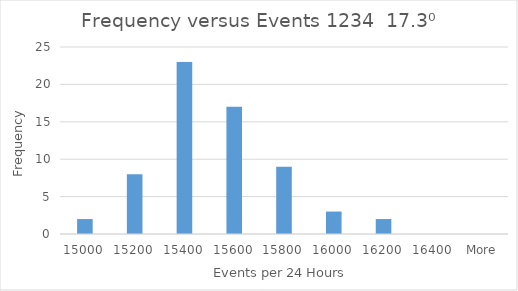
| Category | Frequency |
|---|---|
| 15000 | 2 |
| 15200 | 8 |
| 15400 | 23 |
| 15600 | 17 |
| 15800 | 9 |
| 16000 | 3 |
| 16200 | 2 |
| 16400 | 0 |
| More | 0 |